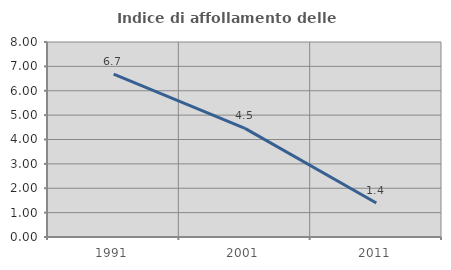
| Category | Indice di affollamento delle abitazioni  |
|---|---|
| 1991.0 | 6.679 |
| 2001.0 | 4.457 |
| 2011.0 | 1.394 |